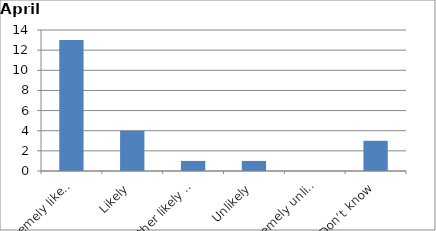
| Category | Series 0 |
|---|---|
| Extremely likely | 13 |
| Likely | 4 |
| Neither likely nor unlikely | 1 |
| Unlikely | 1 |
| Extremely unlikely | 0 |
| Don’t know | 3 |